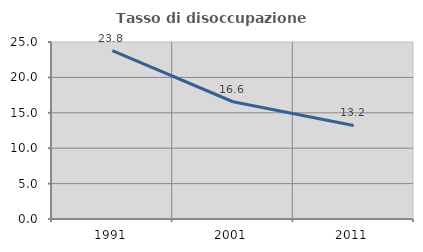
| Category | Tasso di disoccupazione giovanile  |
|---|---|
| 1991.0 | 23.78 |
| 2001.0 | 16.561 |
| 2011.0 | 13.214 |